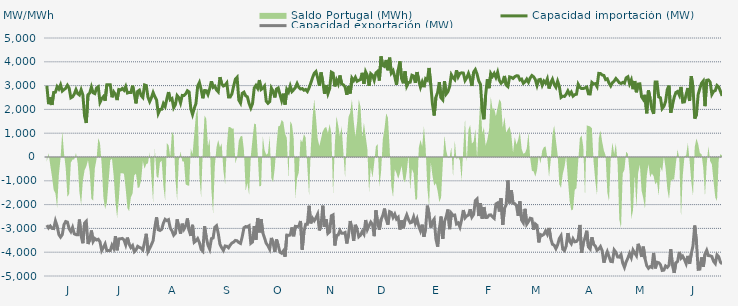
| Category | Capacidad importación (MW) | Capacidad exportación (MW) |
|---|---|---|
| 0 | 2992.5 | -2861.25 |
| 1900-01-01 | 2221.875 | -2981.25 |
| 1900-01-02 | 2505 | -2900.625 |
| 1900-01-03 | 2187.5 | -3000 |
| 1900-01-04 | 2711.75 | -3007.5 |
| 1900-01-05 | 2723.125 | -2684.417 |
| 1900-01-06 | 2956.125 | -2899.25 |
| 1900-01-07 | 2855.625 | -3256.875 |
| 1900-01-08 | 3033.333 | -3366.667 |
| 1900-01-09 | 2771.25 | -3262.5 |
| 1900-01-10 | 2832.375 | -2842.5 |
| 1900-01-11 | 2887.5 | -2711.042 |
| 1900-01-12 | 3015 | -2735.625 |
| 1900-01-13 | 2893.125 | -3015 |
| 1900-01-14 | 2486.25 | -3135 |
| 1900-01-15 | 2529.375 | -2958.75 |
| 1900-01-16 | 2643.75 | -3226.875 |
| 1900-01-17 | 2831.667 | -3261.75 |
| 1900-01-18 | 2662.25 | -3262.25 |
| 1900-01-19 | 2606.25 | -2627.792 |
| 1900-01-20 | 2823.75 | -3316.875 |
| 1900-01-21 | 2608.125 | -3622.5 |
| 1900-01-22 | 1721.458 | -2778.75 |
| 1900-01-23 | 1429.792 | -2700 |
| 1900-01-24 | 2611.875 | -3654.375 |
| 1900-01-25 | 2683.125 | -3478.125 |
| 1900-01-26 | 2941.875 | -3088.125 |
| 1900-01-27 | 2701.042 | -3549.167 |
| 1900-01-28 | 2664.375 | -3423.75 |
| 1900-01-29 | 2900.625 | -3487.5 |
| 1900-01-30 | 2951.25 | -3455.625 |
| 1900-01-31 | 2295 | -3562.5 |
| 1900-02-01 | 2445 | -3930 |
| 1900-02-02 | 2535 | -3798.75 |
| 1900-02-03 | 2364.375 | -3654.375 |
| 1900-02-04 | 3033.333 | -3933.333 |
| 1900-02-05 | 3033.333 | -3933.333 |
| 1900-02-06 | 3033.333 | -3933.333 |
| 1900-02-07 | 2508.75 | -3703.125 |
| 1900-02-08 | 2735.625 | -3838.125 |
| 1900-02-09 | 2628.75 | -3326.25 |
| 1900-02-10 | 2392.5 | -3918.75 |
| 1900-02-11 | 2835 | -3440.625 |
| 1900-02-12 | 2812.5 | -3438.75 |
| 1900-02-13 | 2880 | -3420 |
| 1900-02-14 | 2803.125 | -3481.875 |
| 1900-02-15 | 2964.375 | -3691.875 |
| 1900-02-16 | 2690.625 | -3386.25 |
| 1900-02-17 | 2715 | -3656.25 |
| 1900-02-18 | 2711.25 | -3804.375 |
| 1900-02-19 | 2998.125 | -3720 |
| 1900-02-20 | 2660.625 | -3978.75 |
| 1900-02-21 | 2253.75 | -3907.5 |
| 1900-02-22 | 2760 | -3751.875 |
| 1900-02-23 | 2808.75 | -3796.875 |
| 1900-02-24 | 2580 | -3828.75 |
| 1900-02-25 | 2499.375 | -3907.5 |
| 1900-02-26 | 3028.125 | -3577.5 |
| 1900-02-27 | 3001.875 | -3226.875 |
| 1900-02-28 | 2511.25 | -3976.875 |
| 1900-02-28 | 2326.875 | -3840 |
| 1900-03-01 | 2491.875 | -3684.375 |
| 1900-03-02 | 2710.208 | -3515.417 |
| 1900-03-03 | 2535 | -2956.875 |
| 1900-03-04 | 2401.875 | -2535 |
| 1900-03-05 | 1831.875 | -3056.25 |
| 1900-03-06 | 1995 | -3086.25 |
| 1900-03-07 | 2006.875 | -3037.5 |
| 1900-03-08 | 2244.375 | -2777.5 |
| 1900-03-09 | 2118.75 | -2619.375 |
| 1900-03-10 | 2437.5 | -2673.75 |
| 1900-03-11 | 2728.125 | -2634.375 |
| 1900-03-12 | 2403.75 | -2986.875 |
| 1900-03-13 | 2454.375 | -3099.375 |
| 1900-03-14 | 2071.875 | -3285 |
| 1900-03-15 | 2201.125 | -3208.125 |
| 1900-03-16 | 2582.958 | -2621.458 |
| 1900-03-17 | 2493.625 | -2943.125 |
| 1900-03-18 | 2270.5 | -3218.75 |
| 1900-03-19 | 2587.5 | -2803.125 |
| 1900-03-20 | 2581.875 | -3030 |
| 1900-03-21 | 2651.25 | -2895 |
| 1900-03-22 | 2784.375 | -2583.75 |
| 1900-03-23 | 2733.75 | -3084.375 |
| 1900-03-24 | 2030.625 | -3314.375 |
| 1900-03-25 | 1787.25 | -2849.375 |
| 1900-03-26 | 2040.625 | -3583.667 |
| 1900-03-27 | 2251.875 | -3525 |
| 1900-03-28 | 2977.5 | -3429.375 |
| 1900-03-29 | 3129.375 | -3594.583 |
| 1900-03-30 | 2844.375 | -3877.5 |
| 1900-03-31 | 2467.5 | -3956.25 |
| 1900-04-01 | 2793.75 | -2904.375 |
| 1900-04-02 | 2786.25 | -3382.5 |
| 1900-04-03 | 2626.875 | -3703.125 |
| 1900-04-04 | 2870.625 | -3871.875 |
| 1900-04-05 | 3183.75 | -3431.25 |
| 1900-04-06 | 2926.875 | -3403.125 |
| 1900-04-07 | 2979.375 | -2951.25 |
| 1900-04-08 | 2814.375 | -2887.5 |
| 1900-04-09 | 2737.5 | -3208.125 |
| 1900-04-10 | 3352.5 | -3671.25 |
| 1900-04-11 | 3078.75 | -3808.125 |
| 1900-04-12 | 2983.125 | -3926.25 |
| 1900-04-13 | 3018.75 | -3738.75 |
| 1900-04-14 | 3114.375 | -3751.875 |
| 1900-04-15 | 2520 | -3813.75 |
| 1900-04-16 | 2523.75 | -3697.292 |
| 1900-04-17 | 2658.542 | -3615 |
| 1900-04-18 | 2986.875 | -3575.625 |
| 1900-04-19 | 3273.625 | -3505.833 |
| 1900-04-20 | 3348.75 | -3519.375 |
| 1900-04-21 | 2390.625 | -3592.5 |
| 1900-04-22 | 2265 | -3631.875 |
| 1900-04-23 | 2675.625 | -3346.875 |
| 1900-04-24 | 2724.375 | -2973.75 |
| 1900-04-25 | 2571.875 | -2923.125 |
| 1900-04-26 | 2527.5 | -2930.042 |
| 1900-04-27 | 2244.375 | -2888.708 |
| 1900-04-28 | 2059.333 | -3626.25 |
| 1900-04-29 | 2244.375 | -3570 |
| 1900-04-30 | 2900 | -2900 |
| 1900-05-01 | 3007.5 | -3476.25 |
| 1900-05-02 | 2885.625 | -2562.917 |
| 1900-05-03 | 3233.333 | -3166.667 |
| 1900-05-04 | 2836.875 | -2610.208 |
| 1900-05-05 | 2889.375 | -3189.375 |
| 1900-05-06 | 2979.375 | -3399.375 |
| 1900-05-07 | 2345.625 | -3628.125 |
| 1900-05-08 | 2257.5 | -3725.625 |
| 1900-05-09 | 2323.125 | -3871.875 |
| 1900-05-10 | 2895 | -3401.25 |
| 1900-05-11 | 2760 | -3600 |
| 1900-05-12 | 2503.125 | -3987.75 |
| 1900-05-13 | 2855.625 | -3466.875 |
| 1900-05-14 | 2898.75 | -3720 |
| 1900-05-15 | 2628.75 | -3997.5 |
| 1900-05-16 | 2375.625 | -4044.375 |
| 1900-05-17 | 2660.625 | -3947.875 |
| 1900-05-18 | 2205 | -4190.625 |
| 1900-05-19 | 2840.625 | -3281.25 |
| 1900-05-20 | 2726.25 | -3292.5 |
| 1900-05-21 | 2983.125 | -3279.375 |
| 1900-05-22 | 2750.625 | -2960.625 |
| 1900-05-23 | 2827.5 | -3330 |
| 1900-05-24 | 2917.5 | -2915.625 |
| 1900-05-25 | 3087 | -2927.6 |
| 1900-05-26 | 2928.75 | -2903.792 |
| 1900-05-27 | 2857.5 | -2686.875 |
| 1900-05-28 | 2874.375 | -3894.375 |
| 1900-05-29 | 2803.125 | -3136.875 |
| 1900-05-30 | 2836.875 | -2825.625 |
| 1900-05-31 | 2752.5 | -2825.625 |
| 1900-06-01 | 2906.25 | -2049.375 |
| 1900-06-02 | 3106.875 | -2788.125 |
| 1900-06-03 | 3331.875 | -2572.5 |
| 1900-06-04 | 3513.75 | -2677.5 |
| 1900-06-05 | 3590.625 | -2555.625 |
| 1900-06-06 | 3328.125 | -2400 |
| 1900-06-07 | 2992.5 | -3084.375 |
| 1900-06-08 | 3551.25 | -2874.375 |
| 1900-06-09 | 3150 | -2045.625 |
| 1900-06-10 | 2658.75 | -2932.5 |
| 1900-06-11 | 3023.625 | -2619.5 |
| 1900-06-12 | 2664.375 | -3210 |
| 1900-06-13 | 2872.5 | -3142.5 |
| 1900-06-14 | 3564.375 | -2467.5 |
| 1900-06-15 | 3525 | -2430 |
| 1900-06-16 | 2966.25 | -3718.125 |
| 1900-06-17 | 3236.25 | -3300 |
| 1900-06-18 | 3069.375 | -3275.625 |
| 1900-06-19 | 3425.625 | -3086.25 |
| 1900-06-20 | 3071.25 | -3204.375 |
| 1900-06-21 | 3031.875 | -3206.25 |
| 1900-06-22 | 2947.5 | -3172.5 |
| 1900-06-23 | 2613.75 | -3633.75 |
| 1900-06-24 | 2977.5 | -3258.75 |
| 1900-06-25 | 2670 | -2689.583 |
| 1900-06-26 | 3315 | -3045 |
| 1900-06-27 | 3206.25 | -3523.125 |
| 1900-06-28 | 3348.75 | -2850 |
| 1900-06-29 | 3181.875 | -3038.125 |
| 1900-06-30 | 3225 | -3354.375 |
| 1900-07-01 | 3249.375 | -3283.125 |
| 1900-07-02 | 3536.25 | -3127.5 |
| 1900-07-03 | 3078.75 | -3241.875 |
| 1900-07-04 | 3578.333 | -2647.5 |
| 1900-07-05 | 3425.625 | -3048.75 |
| 1900-07-06 | 2990 | -2885.625 |
| 1900-07-07 | 3498.75 | -2733.75 |
| 1900-07-08 | 3433.125 | -2840.625 |
| 1900-07-09 | 3225 | -3326.25 |
| 1900-07-10 | 3534.375 | -2242.5 |
| 1900-07-11 | 3600 | -2760 |
| 1900-07-12 | 3215.625 | -3054.375 |
| 1900-07-13 | 4224.75 | -2629.167 |
| 1900-07-14 | 3843.75 | -2460 |
| 1900-07-15 | 3802.5 | -2167.5 |
| 1900-07-16 | 4076.25 | -2617.5 |
| 1900-07-17 | 3645 | -2842.5 |
| 1900-07-18 | 4173.75 | -2293.125 |
| 1900-07-19 | 3528.75 | -2328.75 |
| 1900-07-20 | 3628.125 | -2536.875 |
| 1900-07-21 | 3371.25 | -2401.875 |
| 1900-07-22 | 3033.75 | -2606.25 |
| 1900-07-23 | 3658.125 | -2535 |
| 1900-07-24 | 4021.875 | -3046.875 |
| 1900-07-25 | 3286.875 | -2666.25 |
| 1900-07-26 | 3097.5 | -2992.5 |
| 1900-07-27 | 3598.125 | -2625 |
| 1900-07-28 | 2981.25 | -2431.875 |
| 1900-07-29 | 3131.042 | -2628.75 |
| 1900-07-30 | 3142.5 | -2765.625 |
| 1900-07-31 | 3436.875 | -2737.5 |
| 1900-08-01 | 3403.125 | -2520 |
| 1900-08-02 | 3114.375 | -2795.625 |
| 1900-08-03 | 3568.125 | -2604.375 |
| 1900-08-04 | 3206.25 | -2913.75 |
| 1900-08-05 | 2931.042 | -3104.125 |
| 1900-08-06 | 3150 | -2842.75 |
| 1900-08-07 | 2933.875 | -3349.75 |
| 1900-08-08 | 3287.292 | -2997.25 |
| 1900-08-09 | 3230.625 | -2043.75 |
| 1900-08-10 | 3740.417 | -2390.833 |
| 1900-08-11 | 3032.708 | -2969.125 |
| 1900-08-12 | 2212.5 | -2711.25 |
| 1900-08-13 | 1744.583 | -2608.958 |
| 1900-08-14 | 2509.583 | -3447.25 |
| 1900-08-15 | 2711.25 | -3765 |
| 1900-08-16 | 3146.25 | -3022.5 |
| 1900-08-17 | 2484.375 | -2501.875 |
| 1900-08-18 | 2400 | -3436.875 |
| 1900-08-19 | 3185.625 | -2718.75 |
| 1900-08-20 | 2647.5 | -2503.125 |
| 1900-08-21 | 2745 | -2206.875 |
| 1900-08-22 | 2960.625 | -3030 |
| 1900-08-23 | 3457.5 | -2362.5 |
| 1900-08-24 | 3331.875 | -2454.375 |
| 1900-08-25 | 3251.25 | -2439.375 |
| 1900-08-26 | 3643.125 | -2812.5 |
| 1900-08-27 | 3367.5 | -2769.375 |
| 1900-08-28 | 3511.875 | -2945.625 |
| 1900-08-29 | 3538.125 | -2640 |
| 1900-08-30 | 3528.75 | -2227.5 |
| 1900-08-31 | 3215.625 | -2556.917 |
| 1900-09-01 | 3330 | -2475 |
| 1900-09-02 | 3511.875 | -2439.375 |
| 1900-09-03 | 3300 | -2195.625 |
| 1900-09-04 | 2985.208 | -2525.625 |
| 1900-09-05 | 3570 | -2416.875 |
| 1900-09-06 | 3673.125 | -1837.5 |
| 1900-09-07 | 3483.75 | -1764.375 |
| 1900-09-08 | 3198.75 | -2480.625 |
| 1900-09-09 | 3052.5 | -1938.75 |
| 1900-09-10 | 1974.375 | -2591.25 |
| 1900-09-11 | 1586.25 | -2103.75 |
| 1900-09-12 | 2604.375 | -2542.5 |
| 1900-09-13 | 3268.125 | -2536.875 |
| 1900-09-14 | 2891.25 | -2441.25 |
| 1900-09-15 | 3510 | -2430.375 |
| 1900-09-16 | 3390 | -2512.5 |
| 1900-09-17 | 3511.875 | -2578.125 |
| 1900-09-18 | 3343.125 | -1972.5 |
| 1900-09-19 | 3558.75 | -1927.5 |
| 1900-09-20 | 3223.125 | -2289.375 |
| 1900-09-21 | 3101.25 | -1732.083 |
| 1900-09-22 | 3165 | -2851.875 |
| 1900-09-23 | 3405 | -2163.75 |
| 1900-09-24 | 3025 | -1996.875 |
| 1900-09-25 | 2958.75 | -985 |
| 1900-09-26 | 3365.625 | -1948.125 |
| 1900-09-27 | 3345 | -1394.375 |
| 1900-09-28 | 3300 | -1944.667 |
| 1900-09-29 | 3373.125 | -1960.375 |
| 1900-09-30 | 3412.5 | -2045 |
| 1900-10-01 | 3406.875 | -2470.625 |
| 1900-10-02 | 3238.125 | -1861.875 |
| 1900-10-03 | 3271.875 | -2651.25 |
| 1900-10-04 | 3097.5 | -2765.625 |
| 1900-10-05 | 3156.75 | -2177.375 |
| 1900-10-06 | 3271.875 | -2821.875 |
| 1900-10-07 | 3142.5 | -2711.25 |
| 1900-10-08 | 3320.625 | -2572.5 |
| 1900-10-09 | 3423.75 | -2593.75 |
| 1900-10-10 | 3369.375 | -3054.375 |
| 1900-10-11 | 3255 | -2812.5 |
| 1900-10-12 | 3003.75 | -2874.375 |
| 1900-10-13 | 3243.75 | -3588.75 |
| 1900-10-14 | 3260.625 | -3258.75 |
| 1900-10-15 | 3015.625 | -3294.375 |
| 1900-10-16 | 3191.25 | -3247.5 |
| 1900-10-17 | 3106.875 | -3105 |
| 1900-10-18 | 3283.125 | -3245.625 |
| 1900-10-19 | 2878.125 | -2981.25 |
| 1900-10-20 | 3118.125 | -3433.125 |
| 1900-10-21 | 3270 | -3667.5 |
| 1900-10-22 | 3052.5 | -3708.75 |
| 1900-10-23 | 2932.5 | -3853.125 |
| 1900-10-24 | 3183.75 | -3691.875 |
| 1900-10-25 | 2970 | -3425.625 |
| 1900-10-26 | 2502.391 | -3308.478 |
| 1900-10-27 | 2557.5 | -3871.875 |
| 1900-10-28 | 2544.375 | -3935.625 |
| 1900-10-29 | 2636.25 | -3740.625 |
| 1900-10-30 | 2778.75 | -3196.875 |
| 1900-10-31 | 2628.75 | -3541.875 |
| 1900-11-01 | 2728.125 | -3646.667 |
| 1900-11-02 | 2557.5 | -3436.875 |
| 1900-11-03 | 2619.375 | -3562.5 |
| 1900-11-04 | 2636.25 | -3549.375 |
| 1900-11-05 | 3056.25 | -3453.75 |
| 1900-11-06 | 2925 | -2854.5 |
| 1900-11-07 | 2874.375 | -4029.375 |
| 1900-11-08 | 2876.25 | -3616.875 |
| 1900-11-09 | 2900.625 | -3388.125 |
| 1900-11-10 | 2941.875 | -3097.5 |
| 1900-11-11 | 2653.125 | -3780 |
| 1900-11-12 | 2647.5 | -3864.375 |
| 1900-11-13 | 3133.125 | -3371.25 |
| 1900-11-14 | 3069.375 | -3673.125 |
| 1900-11-15 | 3082.5 | -3740.625 |
| 1900-11-16 | 2958.75 | -3920.625 |
| 1900-11-17 | 3513.75 | -3864.375 |
| 1900-11-18 | 3506.25 | -3763.125 |
| 1900-11-19 | 3446.25 | -3937.5 |
| 1900-11-20 | 3425.625 | -4440 |
| 1900-11-21 | 3253.125 | -4179.375 |
| 1900-11-22 | 3285 | -3980.417 |
| 1900-11-23 | 3105 | -4185 |
| 1900-11-24 | 2985 | -4387.5 |
| 1900-11-25 | 3123.75 | -4398.75 |
| 1900-11-26 | 3189.375 | -3905.625 |
| 1900-11-27 | 3298.125 | -4003.125 |
| 1900-11-28 | 3215.625 | -4200 |
| 1900-11-29 | 3121.875 | -4207.5 |
| 1900-11-30 | 3090 | -4100.625 |
| 1900-12-01 | 3133.125 | -4455 |
| 1900-12-02 | 3101.25 | -4636.875 |
| 1900-12-03 | 3324.375 | -4408.125 |
| 1900-12-04 | 3371.25 | -4248.75 |
| 1900-12-05 | 3075 | -4050 |
| 1900-12-06 | 3240 | -4228.125 |
| 1900-12-07 | 2850 | -3910 |
| 1900-12-08 | 3191.25 | -4035 |
| 1900-12-09 | 2720.625 | -4149.375 |
| 1900-12-10 | 3065.625 | -3648.75 |
| 1900-12-11 | 3075 | -3862.5 |
| 1900-12-12 | 2529.375 | -4198.125 |
| 1900-12-13 | 2418.75 | -3766.875 |
| 1900-12-14 | 2611.875 | -4272.292 |
| 1900-12-15 | 1836.25 | -4563.75 |
| 1900-12-16 | 2797.5 | -4674.375 |
| 1900-12-17 | 2448.75 | -4601.25 |
| 1900-12-18 | 2016.917 | -4637.083 |
| 1900-12-19 | 1812.292 | -4032.083 |
| 1900-12-20 | 3151.875 | -4680 |
| 1900-12-21 | 3150 | -4422.708 |
| 1900-12-22 | 2521.875 | -4441.875 |
| 1900-12-23 | 2488.333 | -4522.5 |
| 1900-12-24 | 2032.708 | -4766.25 |
| 1900-12-25 | 2126.25 | -4753.125 |
| 1900-12-26 | 2332.5 | -4578.75 |
| 1900-12-27 | 2836.875 | -4636.875 |
| 1900-12-28 | 2998.125 | -4548.75 |
| 1900-12-29 | 1860 | -3875.625 |
| 1900-12-30 | 2173.125 | -4548.75 |
| 1900-12-31 | 2501.25 | -4869.375 |
| 1901-01-01 | 2709.375 | -4443.75 |
| 1901-01-02 | 2754.375 | -4389.375 |
| 1901-01-03 | 2602.5 | -3988.125 |
| 1901-01-04 | 2943.75 | -4250.625 |
| 1901-01-05 | 2304.917 | -4167.5 |
| 1901-01-06 | 2317.5 | -4303.125 |
| 1901-01-07 | 2636.25 | -4481.25 |
| 1901-01-08 | 2900.625 | -4155 |
| 1901-01-09 | 2354.375 | -4488.75 |
| 1901-01-10 | 3395.625 | -4059.375 |
| 1901-01-11 | 2919.375 | -3729.375 |
| 1901-01-12 | 1612.5 | -2879.583 |
| 1901-01-13 | 1777.708 | -3564.375 |
| 1901-01-14 | 2624.875 | -4719.375 |
| 1901-01-15 | 2883.75 | -4711.875 |
| 1901-01-16 | 3101.25 | -4216.875 |
| 1901-01-17 | 3193.125 | -4616.25 |
| 1901-01-18 | 2137.5 | -4083.75 |
| 1901-01-19 | 3221.25 | -3922.5 |
| 1901-01-20 | 3238.125 | -4143.75 |
| 1901-01-21 | 3146.25 | -4149.375 |
| 1901-01-22 | 2629.583 | -4181.25 |
| 1901-01-23 | 2756.25 | -4383.75 |
| 1901-01-24 | 2791.875 | -4475.625 |
| 1901-01-25 | 3005.625 | -4110 |
| 1901-01-26 | 2943.75 | -4190.625 |
| 1901-01-27 | 2761.875 | -4417.5 |
| 1901-01-28 | 2566.875 | -4494.375 |